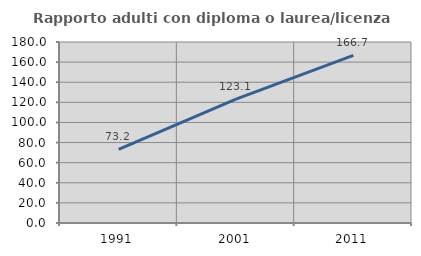
| Category | Rapporto adulti con diploma o laurea/licenza media  |
|---|---|
| 1991.0 | 73.184 |
| 2001.0 | 123.118 |
| 2011.0 | 166.667 |